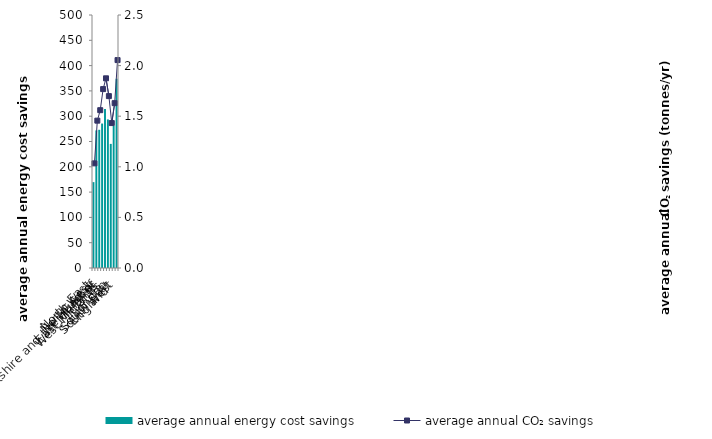
| Category | average annual energy cost savings |
|---|---|
| North East | 169.697 |
| North West | 271.911 |
| Yorkshire and the Humber | 273.141 |
| East Midlands | 285.491 |
| West Midlands | 313.995 |
| East of 
England | 293.617 |
| London | 245.291 |
| South East | 280.664 |
| South West | 374.004 |